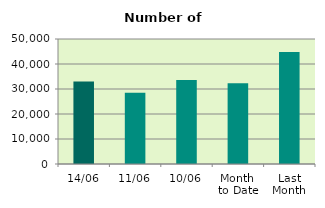
| Category | Series 0 |
|---|---|
| 14/06 | 33002 |
| 11/06 | 28536 |
| 10/06 | 33592 |
| Month 
to Date | 32335.6 |
| Last
Month | 44751.81 |